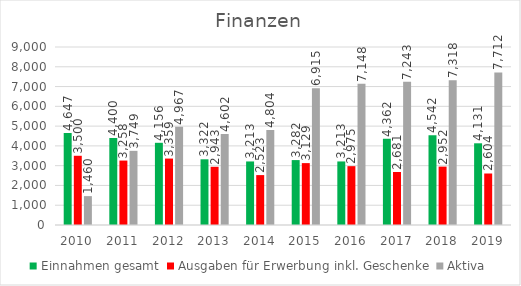
| Category | Einnahmen gesamt | Ausgaben für Erwerbung inkl. Geschenke | Aktiva |
|---|---|---|---|
| 2010.0 | 4647 | 3500 | 1460 |
| 2011.0 | 4400 | 3258 | 3749 |
| 2012.0 | 4156 | 3359 | 4967 |
| 2013.0 | 3322 | 2943 | 4602 |
| 2014.0 | 3213 | 2523 | 4804 |
| 2015.0 | 3282 | 3129 | 6915 |
| 2016.0 | 3213 | 2975 | 7148 |
| 2017.0 | 4362 | 2681 | 7242.79 |
| 2018.0 | 4542 | 2952 | 7318 |
| 2019.0 | 4131 | 2604 | 7712 |